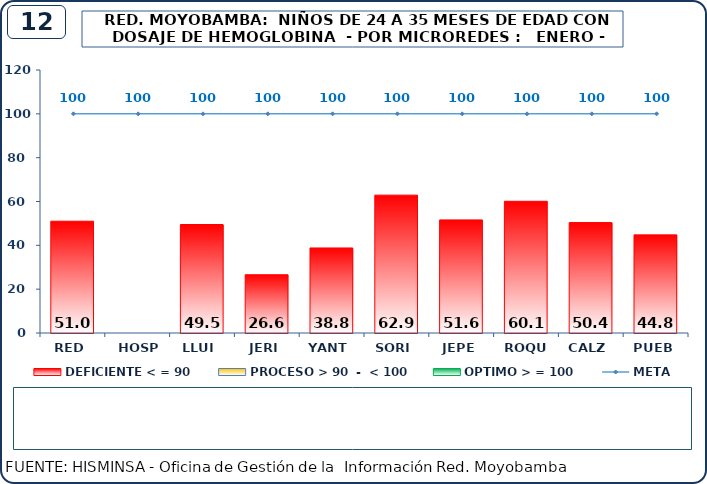
| Category | DEFICIENTE < = 90 | PROCESO > 90  -  < 100 | OPTIMO > = 100 |
|---|---|---|---|
| RED | 51 | 0 | 0 |
| HOSP | 0 | 0 | 0 |
| LLUI | 49.5 | 0 | 0 |
| JERI | 26.6 | 0 | 0 |
| YANT | 38.8 | 0 | 0 |
| SORI | 62.9 | 0 | 0 |
| JEPE | 51.6 | 0 | 0 |
| ROQU | 60.1 | 0 | 0 |
| CALZ | 50.4 | 0 | 0 |
| PUEB | 44.8 | 0 | 0 |